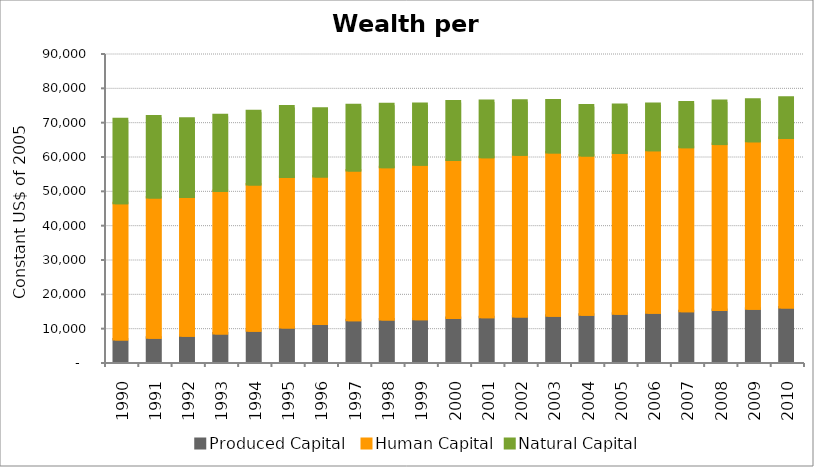
| Category | Produced Capital  | Human Capital | Natural Capital |
|---|---|---|---|
| 1990.0 | 6589.249 | 39665.581 | 24448.2 |
| 1991.0 | 7087.277 | 40792.959 | 23604.626 |
| 1992.0 | 7633.909 | 40426.553 | 22798.286 |
| 1993.0 | 8298.721 | 41524.433 | 22028.566 |
| 1994.0 | 9075.823 | 42659.231 | 21263.077 |
| 1995.0 | 10062.685 | 43849.025 | 20510.964 |
| 1996.0 | 11074.221 | 42925.704 | 19770.932 |
| 1997.0 | 12130.95 | 43638.589 | 19046.314 |
| 1998.0 | 12343.265 | 44394.66 | 18340.815 |
| 1999.0 | 12460.848 | 45020.409 | 17667.5 |
| 2000.0 | 12780.485 | 46071.667 | 17018.247 |
| 2001.0 | 13038.165 | 46598.322 | 16365.424 |
| 2002.0 | 13268.146 | 47093.408 | 15735.696 |
| 2003.0 | 13499.433 | 47553.015 | 15124.322 |
| 2004.0 | 13744.495 | 46390.039 | 14541.278 |
| 2005.0 | 14021.382 | 46863.247 | 14004.282 |
| 2006.0 | 14359.266 | 47309.468 | 13499.546 |
| 2007.0 | 14778.571 | 47781.092 | 13020.501 |
| 2008.0 | 15178.973 | 48282.59 | 12558.769 |
| 2009.0 | 15476.17 | 48801.74 | 12118.057 |
| 2010.0 | 15850.086 | 49409.124 | 11690.155 |